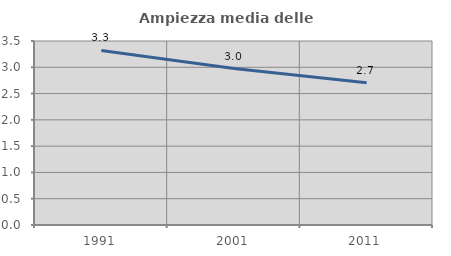
| Category | Ampiezza media delle famiglie |
|---|---|
| 1991.0 | 3.319 |
| 2001.0 | 2.976 |
| 2011.0 | 2.704 |